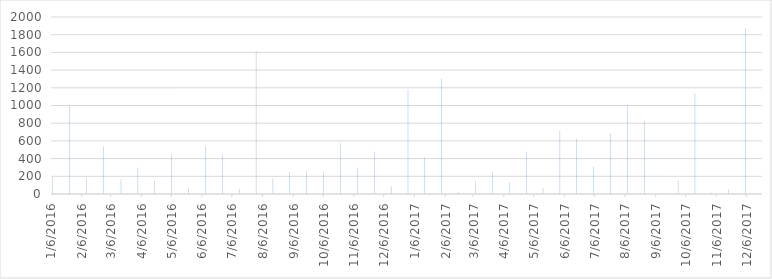
| Category | Order Value |
|---|---|
| 1/6/16 | 189.05 |
| 1/23/16 | 999.5 |
| 2/9/16 | 179.64 |
| 2/26/16 | 539.73 |
| 3/15/16 | 167.44 |
| 4/1/16 | 299.4 |
| 4/18/16 | 149.25 |
| 5/5/16 | 449.1 |
| 5/22/16 | 63.68 |
| 6/8/16 | 539.4 |
| 6/25/16 | 449.1 |
| 7/12/16 | 57.71 |
| 7/29/16 | 1619.19 |
| 8/15/16 | 174.65 |
| 9/1/16 | 250 |
| 9/18/16 | 255.84 |
| 10/5/16 | 251.72 |
| 10/22/16 | 575.36 |
| 11/8/16 | 299.85 |
| 11/25/16 | 479.04 |
| 12/12/16 | 86.43 |
| 12/29/16 | 1183.26 |
| 1/15/17 | 413.54 |
| 2/1/17 | 1305 |
| 2/18/17 | 19.96 |
| 3/7/17 | 139.93 |
| 3/24/17 | 249.5 |
| 4/10/17 | 131.34 |
| 4/27/17 | 479.04 |
| 5/14/17 | 68.37 |
| 5/31/17 | 719.2 |
| 6/17/17 | 625 |
| 7/4/17 | 309.38 |
| 7/21/17 | 686.95 |
| 8/7/17 | 1005.9 |
| 8/24/17 | 825 |
| 9/10/17 | 9.03 |
| 9/27/17 | 151.24 |
| 10/14/17 | 1139.43 |
| 10/31/17 | 18.06 |
| 11/17/17 | 54.89 |
| 12/4/17 | 1879.06 |
| 12/21/17 | 139.72 |